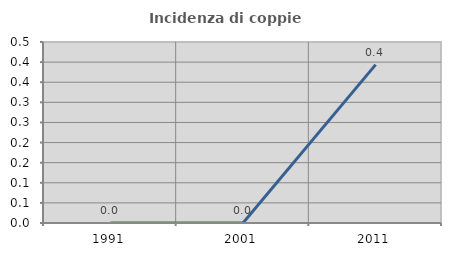
| Category | Incidenza di coppie miste |
|---|---|
| 1991.0 | 0 |
| 2001.0 | 0 |
| 2011.0 | 0.394 |